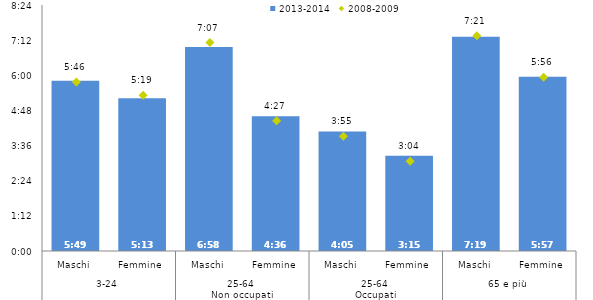
| Category | 2013-2014 |
|---|---|
| 0 | 0.242 |
| 1 | 0.217 |
| 2 | 0.29 |
| 3 | 0.192 |
| 4 | 0.17 |
| 5 | 0.135 |
| 6 | 0.305 |
| 7 | 0.248 |